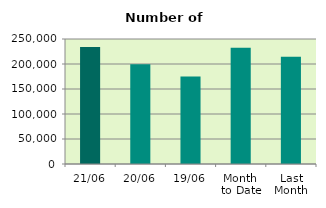
| Category | Series 0 |
|---|---|
| 21/06 | 233958 |
| 20/06 | 199436 |
| 19/06 | 174856 |
| Month 
to Date | 232300.267 |
| Last
Month | 214383.182 |